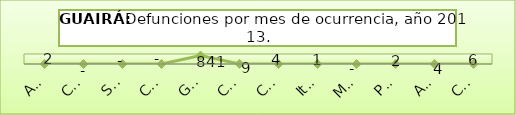
| Category | DEFUNCIÓN |
|---|---|
| Asunción | 2 |
| Concepción | 0 |
| San Pedro | 0 |
| Cordillera | 0 |
| Guairá | 841 |
| Caaguazú | 9 |
| Caazapá | 4 |
| Itapúa | 1 |
| Misiones | 0 |
| Paraguarí | 2 |
| Alto Paraná | 4 |
| Central | 6 |